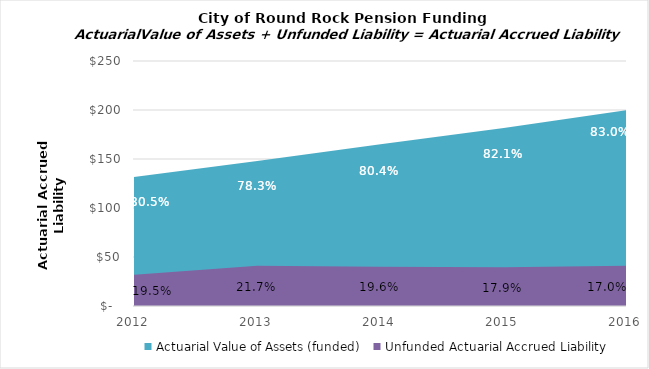
| Category | Actuarial Value of Assets (funded) | Unfunded Actuarial Accrued Liability |
|---|---|---|
| 2012.0 | 131506866 | 31833339 |
| 2013.0 | 148052738 | 40960296 |
| 2014.0 | 164980629 | 40147653 |
| 2015.0 | 181706192 | 39530331 |
| 2016.0 | 199934948 | 40974851 |